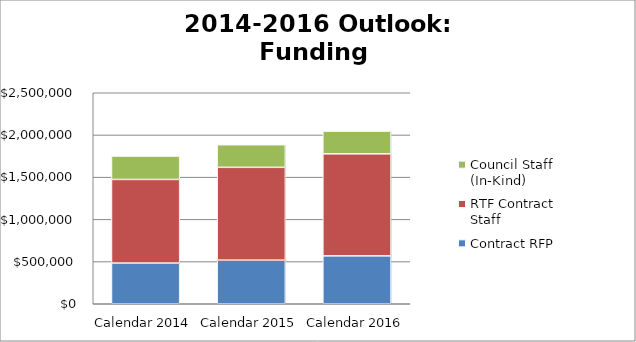
| Category | Contract RFP | RTF Contract Staff | Council Staff (In-Kind) |
|---|---|---|---|
| Calendar 2014 | 482000 | 991000 | 277100 |
| Calendar 2015 | 516800 | 1099611 | 268268.5 |
| Calendar 2016 | 567425 | 1208935.416 | 269204 |